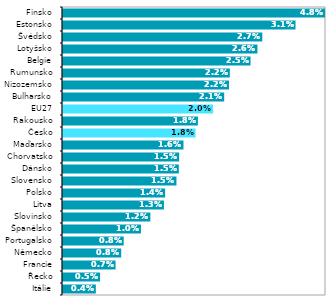
| Category | 2019* |
|---|---|
| Itálie | 0.004 |
| Řecko | 0.005 |
| Francie | 0.007 |
| Německo | 0.008 |
| Portugalsko | 0.008 |
| Španělsko | 0.01 |
| Slovinsko | 0.012 |
| Litva | 0.013 |
| Polsko | 0.014 |
| Slovensko | 0.015 |
| Dánsko | 0.015 |
| Chorvatsko | 0.015 |
| Maďarsko | 0.016 |
| Česko | 0.018 |
| Rakousko | 0.018 |
| EU27 | 0.02 |
| Bulharsko | 0.021 |
| Nizozemsko | 0.022 |
| Rumunsko | 0.022 |
| Belgie | 0.025 |
| Lotyšsko | 0.026 |
| Švédsko | 0.027 |
| Estonsko | 0.031 |
| Finsko | 0.048 |